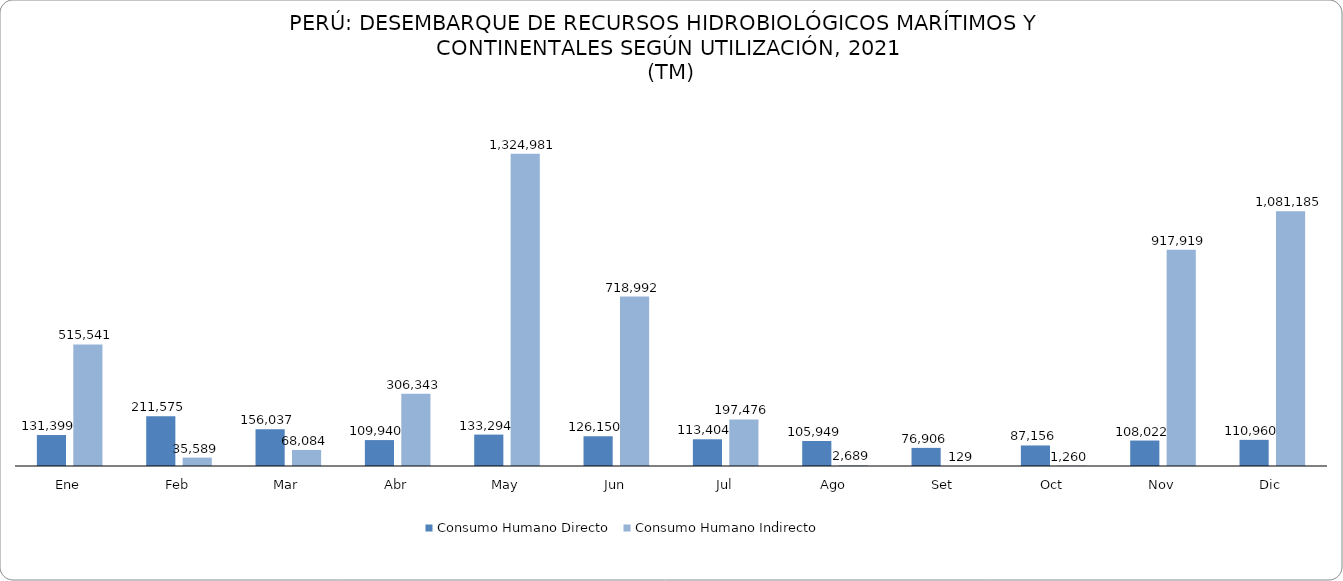
| Category | Consumo Humano Directo | Consumo Humano Indirecto |
|---|---|---|
| Ene | 131398.546 | 515540.899 |
| Feb | 211574.795 | 35589.427 |
| Mar | 156036.732 | 68083.633 |
| Abr | 109939.539 | 306343.476 |
| May | 133293.709 | 1324980.655 |
| Jun | 126149.732 | 718992.249 |
| Jul | 113403.702 | 197475.73 |
| Ago | 105948.847 | 2689.467 |
| Set | 76906.121 | 128.828 |
| Oct | 87155.68 | 1260.316 |
| Nov | 108021.633 | 917919.23 |
| Dic | 110960.121 | 1081185.456 |